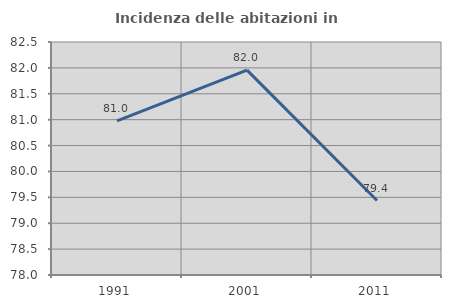
| Category | Incidenza delle abitazioni in proprietà  |
|---|---|
| 1991.0 | 80.976 |
| 2001.0 | 81.957 |
| 2011.0 | 79.438 |